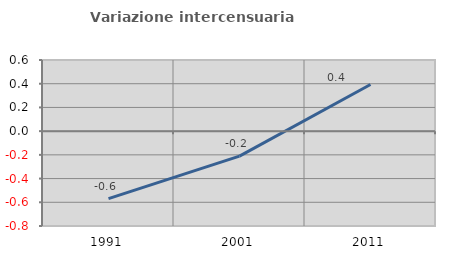
| Category | Variazione intercensuaria annua |
|---|---|
| 1991.0 | -0.569 |
| 2001.0 | -0.211 |
| 2011.0 | 0.393 |